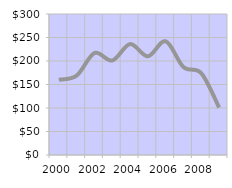
| Category | Total Number
 of Employees  |
|---|---|
| 2000.0 | 160 |
| 2001.0 | 169 |
| 2002.0 | 217 |
| 2003.0 | 201 |
| 2004.0 | 236 |
| 2005.0 | 210 |
| 2006.0 | 242 |
| 2007.0 | 187 |
| 2008.0 | 174 |
| 2009.0 | 101 |